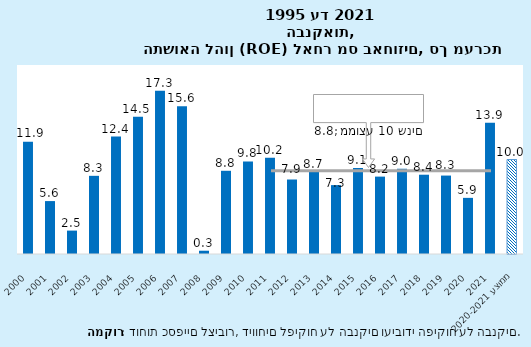
| Category | Series 0 |
|---|---|
| 2000 | 11.888 |
| 2001 | 5.6 |
| 2002 | 2.477 |
| 2003 | 8.272 |
| 2004 | 12.433 |
| 2005 | 14.531 |
| 2006 | 17.273 |
| 2007 | 15.632 |
| 2008 | 0.347 |
| 2009 | 8.805 |
| 2010 | 9.793 |
| 2011 | 10.175 |
| 2012 | 7.883 |
| 2013 | 8.684 |
| 2014 | 7.29 |
| 2015 | 9.09 |
| 2016 | 8.19 |
| 2017 | 9.03 |
| 2018 | 8.39 |
| 2019 | 8.3 |
| 2020 | 5.94 |
| 2021 | 13.9 |
| ממוצע 2020-2021 | 10 |